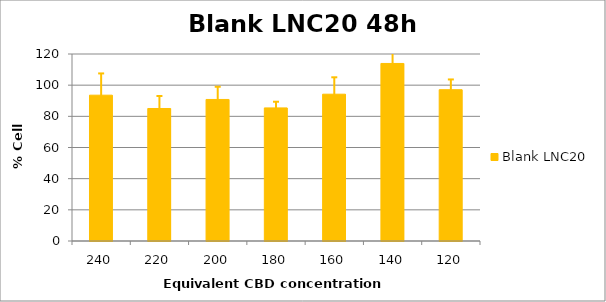
| Category | Blank LNC20 |
|---|---|
| 240.0 | 93.575 |
| 220.0 | 85.031 |
| 200.0 | 90.831 |
| 180.0 | 85.413 |
| 160.0 | 94.208 |
| 140.0 | 113.929 |
| 120.0 | 97.09 |